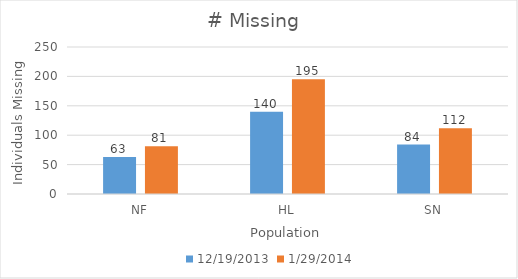
| Category | 12/19/2013 | 1/29/2014 |
|---|---|---|
| NF | 63 | 81 |
| HL | 140 | 195 |
| SN | 84 | 112 |